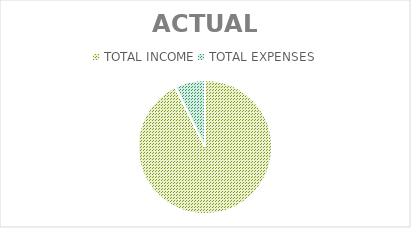
| Category | Series 0 |
|---|---|
| TOTAL INCOME | 3800 |
| TOTAL EXPENSES | 300 |